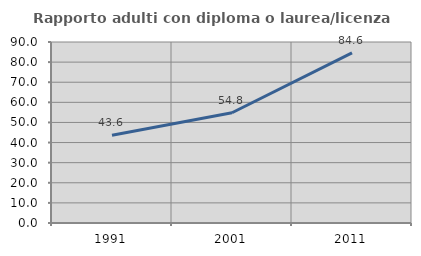
| Category | Rapporto adulti con diploma o laurea/licenza media  |
|---|---|
| 1991.0 | 43.636 |
| 2001.0 | 54.812 |
| 2011.0 | 84.615 |